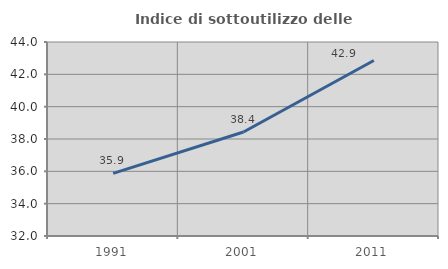
| Category | Indice di sottoutilizzo delle abitazioni  |
|---|---|
| 1991.0 | 35.87 |
| 2001.0 | 38.431 |
| 2011.0 | 42.857 |